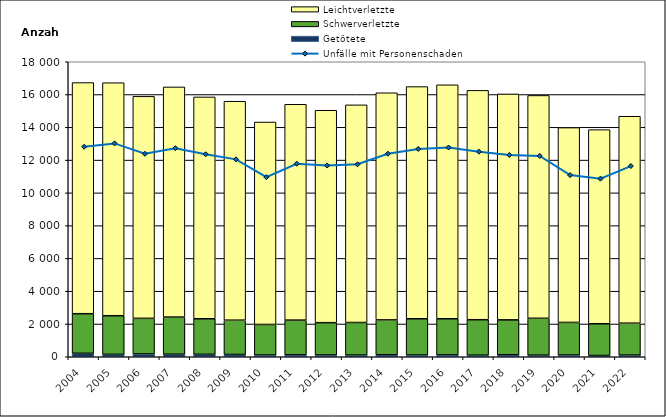
| Category | Getötete | Schwerverletzte | Leichtverletzte |
|---|---|---|---|
| 2004.0 | 212 | 2415 | 14104 |
| 2005.0 | 148 | 2355 | 14219 |
| 2006.0 | 172 | 2173 | 13546 |
| 2007.0 | 156 | 2265 | 14043 |
| 2008.0 | 149 | 2169 | 13535 |
| 2009.0 | 140 | 2092 | 13360 |
| 2010.0 | 108 | 1862 | 12352 |
| 2011.0 | 120 | 2116 | 13169 |
| 2012.0 | 110 | 1970 | 12961 |
| 2013.0 | 103 | 1987 | 13280 |
| 2014.0 | 121 | 2128 | 13858 |
| 2015.0 | 107 | 2211 | 14167 |
| 2016.0 | 114 | 2205 | 14274 |
| 2017.0 | 100 | 2160 | 13995 |
| 2018.0 | 122 | 2129 | 13785 |
| 2019.0 | 100 | 2248 | 13597 |
| 2020.0 | 107 | 1988 | 11888 |
| 2021.0 | 77 | 1937 | 11844 |
| 2022.0 | 102 | 1947 | 12627 |